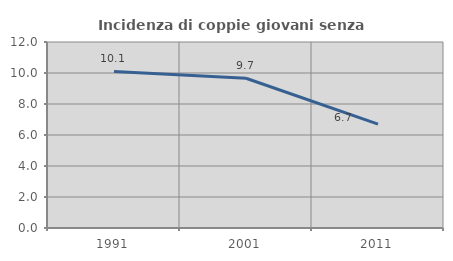
| Category | Incidenza di coppie giovani senza figli |
|---|---|
| 1991.0 | 10.097 |
| 2001.0 | 9.664 |
| 2011.0 | 6.706 |